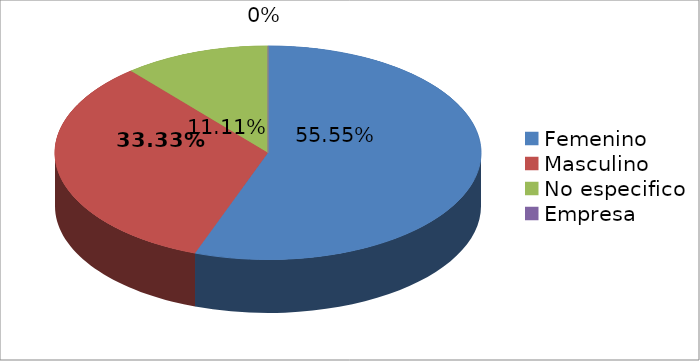
| Category | Series 0 |
|---|---|
| Femenino | 5 |
| Masculino | 3 |
| No especifico | 1 |
| Empresa | 0 |